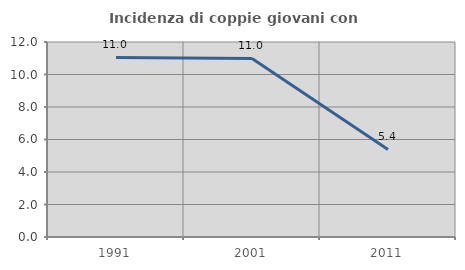
| Category | Incidenza di coppie giovani con figli |
|---|---|
| 1991.0 | 11.047 |
| 2001.0 | 10.989 |
| 2011.0 | 5.389 |